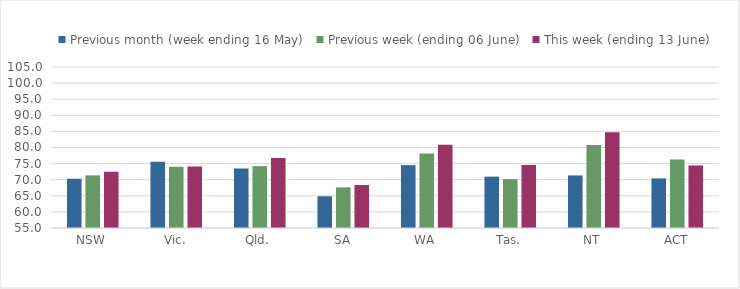
| Category | Previous month (week ending 16 May) | Previous week (ending 06 June) | This week (ending 13 June) |
|---|---|---|---|
| NSW | 70.298 | 71.346 | 72.472 |
| Vic. | 75.58 | 74.009 | 74.1 |
| Qld. | 73.48 | 74.196 | 76.74 |
| SA | 64.856 | 67.619 | 68.362 |
| WA | 74.509 | 78.118 | 80.844 |
| Tas. | 70.951 | 70.159 | 74.565 |
| NT | 71.335 | 80.766 | 84.762 |
| ACT | 70.411 | 76.287 | 74.418 |